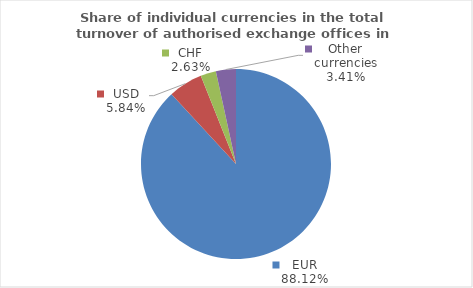
| Category | Series 0 |
|---|---|
| EUR | 88.125 |
| USD | 5.838 |
| CHF | 2.632 |
| Other currencies | 3.405 |